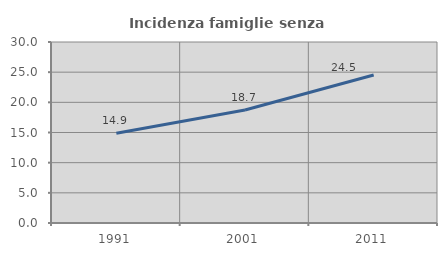
| Category | Incidenza famiglie senza nuclei |
|---|---|
| 1991.0 | 14.873 |
| 2001.0 | 18.722 |
| 2011.0 | 24.533 |